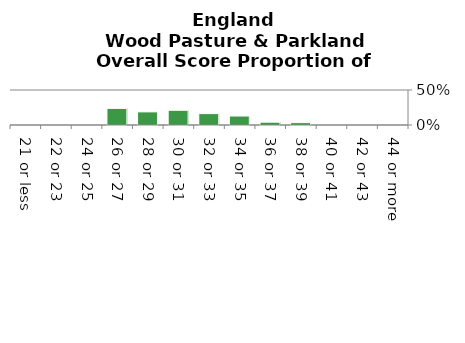
| Category | Wood Pasture & Parkland |
|---|---|
| 21 or less | 0 |
| 22 or 23 | 0 |
| 24 or 25 | 0 |
| 26 or 27 | 0.237 |
| 28 or 29 | 0.188 |
| 30 or 31 | 0.21 |
| 32 or 33 | 0.163 |
| 34 or 35 | 0.128 |
| 36 or 37 | 0.04 |
| 38 or 39 | 0.034 |
| 40 or 41 | 0 |
| 42 or 43 | 0 |
| 44 or more | 0 |